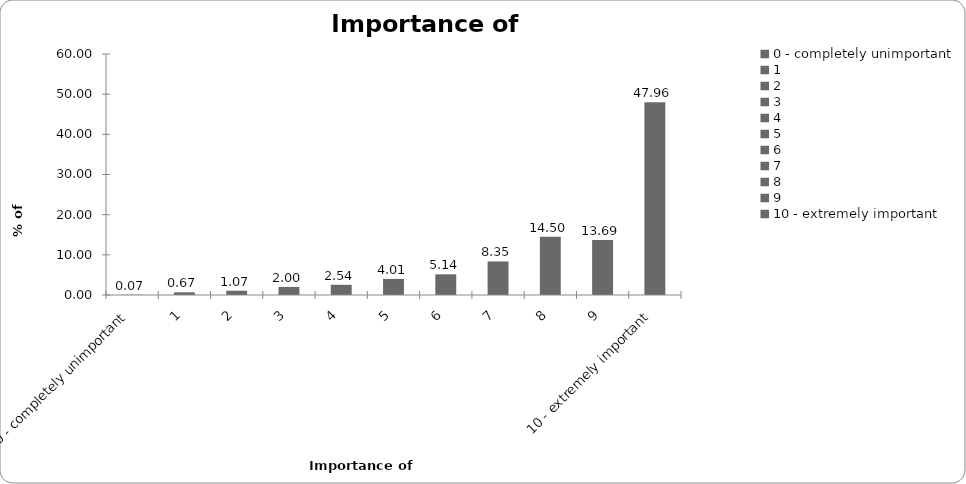
| Category | Importance of insurance |
|---|---|
| 0 - completely unimportant | 0.067 |
| 1 | 0.668 |
| 2 | 1.069 |
| 3 | 2.004 |
| 4 | 2.538 |
| 5 | 4.008 |
| 6 | 5.144 |
| 7 | 8.35 |
| 8 | 14.496 |
| 9 | 13.694 |
| 10 - extremely important | 47.963 |